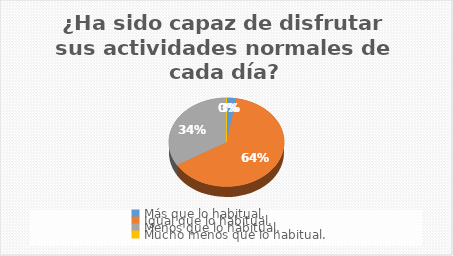
| Category | ¿Ha sido capaz de disfrutar sus actividades normales de cada día? |
|---|---|
| Más que lo habitual. | 3 |
| Igual que lo habitual. | 70 |
| Menos que lo habitual. | 37 |
| Mucho menos que lo habitual. | 0 |